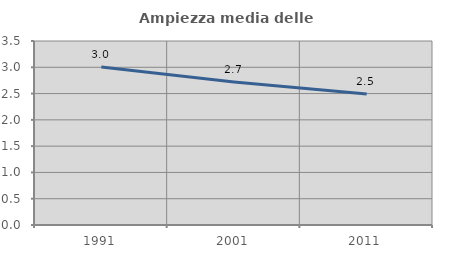
| Category | Ampiezza media delle famiglie |
|---|---|
| 1991.0 | 3.007 |
| 2001.0 | 2.722 |
| 2011.0 | 2.492 |